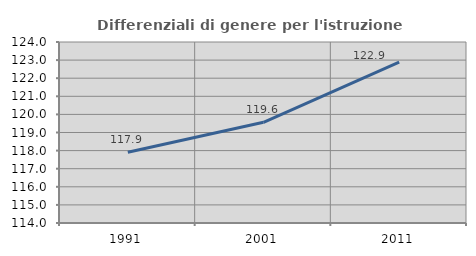
| Category | Differenziali di genere per l'istruzione superiore |
|---|---|
| 1991.0 | 117.912 |
| 2001.0 | 119.562 |
| 2011.0 | 122.884 |